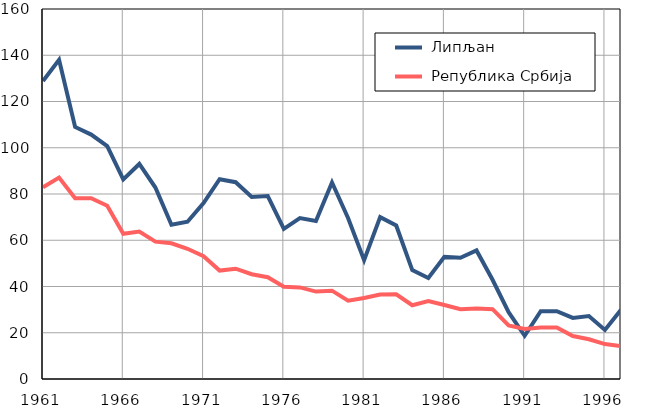
| Category |  Липљан |  Република Србија |
|---|---|---|
| 1961.0 | 128.9 | 82.9 |
| 1962.0 | 138 | 87.1 |
| 1963.0 | 109 | 78.2 |
| 1964.0 | 105.7 | 78.2 |
| 1965.0 | 100.7 | 74.9 |
| 1966.0 | 86.3 | 62.8 |
| 1967.0 | 93 | 63.8 |
| 1968.0 | 82.8 | 59.4 |
| 1969.0 | 66.7 | 58.7 |
| 1970.0 | 68 | 56.3 |
| 1971.0 | 76.1 | 53.1 |
| 1972.0 | 86.4 | 46.9 |
| 1973.0 | 85.1 | 47.7 |
| 1974.0 | 78.7 | 45.3 |
| 1975.0 | 79.1 | 44 |
| 1976.0 | 64.9 | 39.9 |
| 1977.0 | 69.6 | 39.6 |
| 1978.0 | 68.3 | 37.8 |
| 1979.0 | 85 | 38.2 |
| 1980.0 | 69.6 | 33.9 |
| 1981.0 | 51.4 | 35 |
| 1982.0 | 70 | 36.5 |
| 1983.0 | 66.4 | 36.6 |
| 1984.0 | 47.1 | 31.9 |
| 1985.0 | 43.7 | 33.7 |
| 1986.0 | 52.8 | 32 |
| 1987.0 | 52.4 | 30.2 |
| 1988.0 | 55.6 | 30.5 |
| 1989.0 | 42.9 | 30.2 |
| 1990.0 | 28.9 | 23.2 |
| 1991.0 | 18.7 | 21.6 |
| 1992.0 | 29.3 | 22.3 |
| 1993.0 | 29.3 | 22.3 |
| 1994.0 | 26.4 | 18.6 |
| 1995.0 | 27.2 | 17.2 |
| 1996.0 | 21.2 | 15.1 |
| 1997.0 | 29.9 | 14.2 |